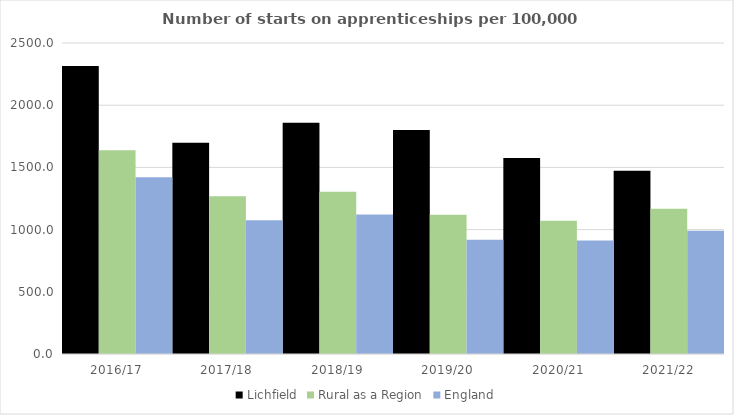
| Category | Lichfield | Rural as a Region | England |
|---|---|---|---|
| 2016/17 | 2316 | 1638.789 | 1420 |
| 2017/18 | 1699 | 1267.474 | 1075 |
| 2018/19 | 1859 | 1304.57 | 1122 |
| 2019/20 | 1801 | 1119.662 | 918 |
| 2020/21 | 1576 | 1070.748 | 912 |
| 2021/22 | 1473 | 1167.68 | 991 |